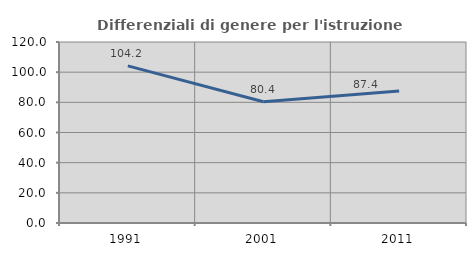
| Category | Differenziali di genere per l'istruzione superiore |
|---|---|
| 1991.0 | 104.169 |
| 2001.0 | 80.429 |
| 2011.0 | 87.442 |